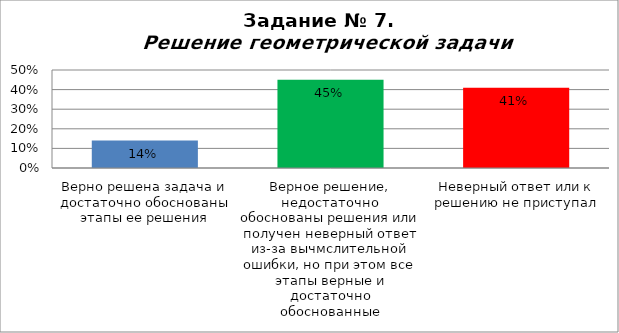
| Category | Решение геометрической задачи  |
|---|---|
| Верно решена задача и достаточно обоснованы этапы ее решения | 0.14 |
| Верное решение, недостаточно обоснованы решения или получен неверный ответ из-за вычмслительной ошибки, но при этом все этапы верные и достаточно обоснованные | 0.45 |
| Неверный ответ или к решению не приступал | 0.41 |